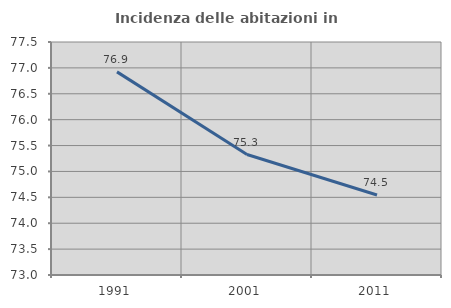
| Category | Incidenza delle abitazioni in proprietà  |
|---|---|
| 1991.0 | 76.923 |
| 2001.0 | 75.326 |
| 2011.0 | 74.545 |